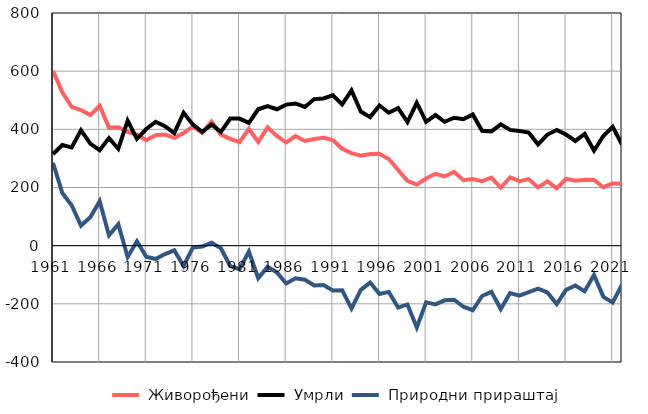
| Category |  Живорођени |  Умрли |  Природни прираштај |
|---|---|---|---|
| 1961.0 | 600 | 315 | 285 |
| 1962.0 | 527 | 346 | 181 |
| 1963.0 | 477 | 338 | 139 |
| 1964.0 | 466 | 397 | 69 |
| 1965.0 | 449 | 351 | 98 |
| 1966.0 | 481 | 328 | 153 |
| 1967.0 | 406 | 370 | 36 |
| 1968.0 | 407 | 333 | 74 |
| 1969.0 | 391 | 430 | -39 |
| 1970.0 | 382 | 367 | 15 |
| 1971.0 | 363 | 401 | -38 |
| 1972.0 | 380 | 426 | -46 |
| 1973.0 | 382 | 411 | -29 |
| 1974.0 | 371 | 387 | -16 |
| 1975.0 | 387 | 457 | -70 |
| 1976.0 | 410 | 416 | -6 |
| 1977.0 | 388 | 391 | -3 |
| 1978.0 | 427 | 417 | 10 |
| 1979.0 | 382 | 391 | -9 |
| 1980.0 | 367 | 437 | -70 |
| 1981.0 | 356 | 437 | -81 |
| 1982.0 | 402 | 422 | -20 |
| 1983.0 | 357 | 469 | -112 |
| 1984.0 | 407 | 480 | -73 |
| 1985.0 | 377 | 469 | -92 |
| 1986.0 | 355 | 485 | -130 |
| 1987.0 | 377 | 489 | -112 |
| 1988.0 | 360 | 477 | -117 |
| 1989.0 | 367 | 504 | -137 |
| 1990.0 | 371 | 506 | -135 |
| 1991.0 | 363 | 517 | -154 |
| 1992.0 | 333 | 486 | -153 |
| 1993.0 | 318 | 534 | -216 |
| 1994.0 | 309 | 461 | -152 |
| 1995.0 | 315 | 442 | -127 |
| 1996.0 | 316 | 482 | -166 |
| 1997.0 | 298 | 457 | -159 |
| 1998.0 | 260 | 473 | -213 |
| 1999.0 | 223 | 425 | -202 |
| 2000.0 | 210 | 491 | -281 |
| 2001.0 | 231 | 426 | -195 |
| 2002.0 | 247 | 449 | -202 |
| 2003.0 | 238 | 426 | -188 |
| 2004.0 | 254 | 440 | -186 |
| 2005.0 | 225 | 435 | -210 |
| 2006.0 | 229 | 451 | -222 |
| 2007.0 | 222 | 395 | -173 |
| 2008.0 | 234 | 393 | -159 |
| 2009.0 | 199 | 417 | -218 |
| 2010.0 | 235 | 398 | -163 |
| 2011.0 | 222 | 394 | -172 |
| 2012.0 | 229 | 389 | -160 |
| 2013.0 | 200 | 348 | -148 |
| 2014.0 | 221 | 382 | -161 |
| 2015.0 | 197 | 398 | -201 |
| 2016.0 | 230 | 382 | -152 |
| 2017.0 | 223 | 360 | -137 |
| 2018.0 | 227 | 384 | -157 |
| 2019.0 | 226 | 327 | -101 |
| 2020.0 | 201 | 377 | -176 |
| 2021.0 | 214 | 409 | -195 |
| 2022.0 | 214 | 348 | -134 |